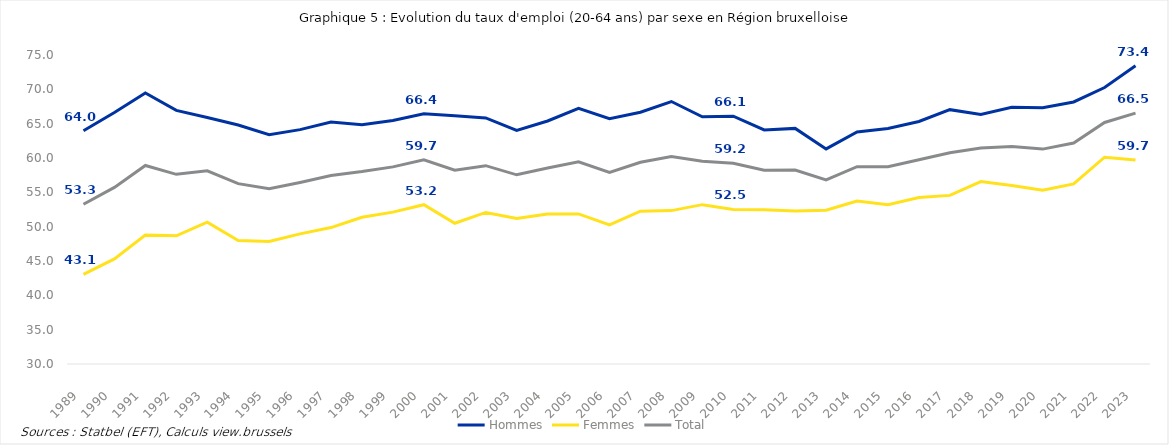
| Category | Hommes | Femmes | Total |
|---|---|---|---|
| 1989.0 | 63.976 | 43.053 | 53.264 |
| 1990.0 | 66.614 | 45.311 | 55.725 |
| 1991.0 | 69.48 | 48.771 | 58.909 |
| 1992.0 | 66.933 | 48.67 | 57.621 |
| 1993.0 | 65.892 | 50.652 | 58.145 |
| 1994.0 | 64.798 | 47.981 | 56.264 |
| 1995.0 | 63.401 | 47.834 | 55.532 |
| 1996.0 | 64.134 | 48.952 | 56.444 |
| 1997.0 | 65.248 | 49.87 | 57.458 |
| 1998.0 | 64.855 | 51.376 | 58.03 |
| 1999.0 | 65.46 | 52.12 | 58.709 |
| 2000.0 | 66.441 | 53.197 | 59.738 |
| 2001.0 | 66.147 | 50.492 | 58.229 |
| 2002.0 | 65.829 | 52.073 | 58.881 |
| 2003.0 | 64.024 | 51.176 | 57.55 |
| 2004.0 | 65.392 | 51.844 | 58.551 |
| 2005.0 | 67.219 | 51.855 | 59.446 |
| 2006.0 | 65.714 | 50.251 | 57.893 |
| 2007.0 | 66.662 | 52.26 | 59.384 |
| 2008.0 | 68.225 | 52.337 | 60.202 |
| 2009.0 | 66.004 | 53.206 | 59.543 |
| 2010.0 | 66.093 | 52.509 | 59.236 |
| 2011.0 | 64.081 | 52.461 | 58.219 |
| 2012.0 | 64.314 | 52.265 | 58.241 |
| 2013.0 | 61.325 | 52.385 | 56.82 |
| 2014.0 | 63.791 | 53.733 | 58.727 |
| 2015.0 | 64.295 | 53.209 | 58.721 |
| 2016.0 | 65.322 | 54.257 | 59.757 |
| 2017.0 | 67.041 | 54.555 | 60.762 |
| 2018.0 | 66.347 | 56.563 | 61.439 |
| 2019.0 | 67.391 | 55.994 | 61.679 |
| 2020.0 | 67.307 | 55.307 | 61.296 |
| 2021.0 | 68.16 | 56.23 | 62.19 |
| 2022.0 | 70.262 | 60.118 | 65.171 |
| 2023.0 | 73.442 | 59.726 | 66.544 |